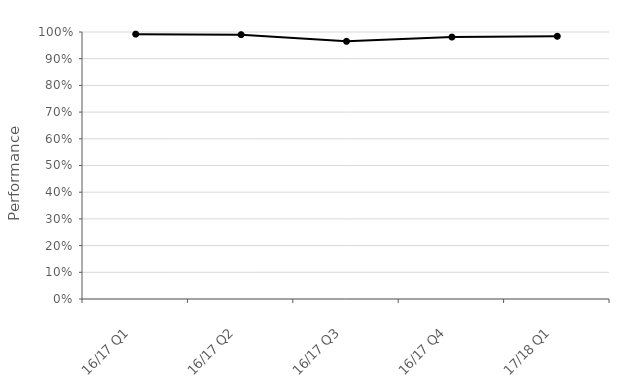
| Category | National |
|---|---|
| 16/17 Q1 | 0.992 |
| 16/17 Q2 | 0.99 |
| 16/17 Q3 | 0.965 |
| 16/17 Q4 | 0.981 |
| 17/18 Q1 | 0.984 |